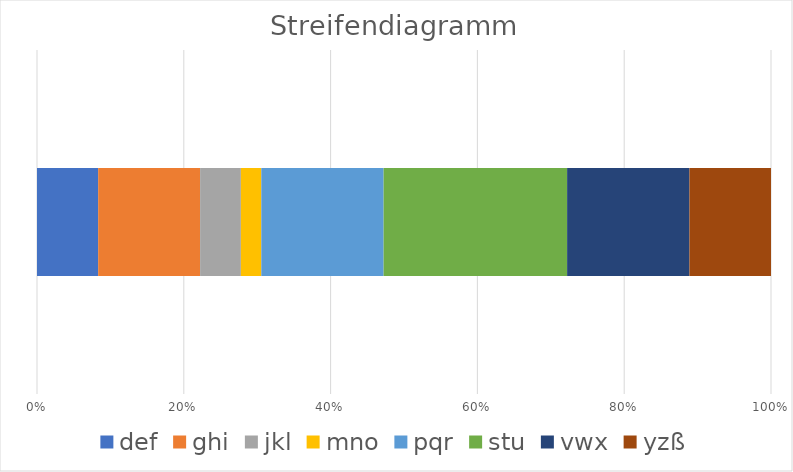
| Category | def | ghi | jkl | mno | pqr | stu | vwx | yzß |
|---|---|---|---|---|---|---|---|---|
| 0 | 3 | 5 | 2 | 1 | 6 | 9 | 6 | 4 |